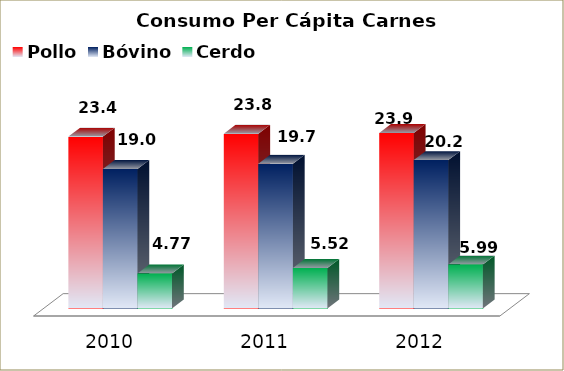
| Category | Pollo | Bóvino | Cerdo |
|---|---|---|---|
| 2010.0 | 23.4 | 19 | 4.77 |
| 2011.0 | 23.8 | 19.7 | 5.52 |
| 2012.0 | 23.9 | 20.2 | 5.99 |